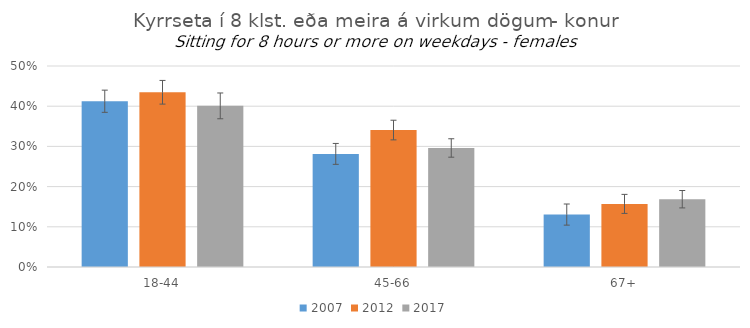
| Category | 2007 | 2012 | 2017 |
|---|---|---|---|
| 18-44 | 0.412 | 0.435 | 0.401 |
| 45-66 | 0.281 | 0.341 | 0.296 |
| 67+ | 0.13 | 0.157 | 0.169 |